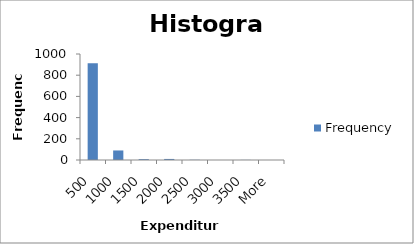
| Category | Frequency |
|---|---|
| 500 | 912 |
| 1000 | 90 |
| 1500 | 8 |
| 2000 | 10 |
| 2500 | 2 |
| 3000 | 0 |
| 3500 | 1 |
| More | 0 |